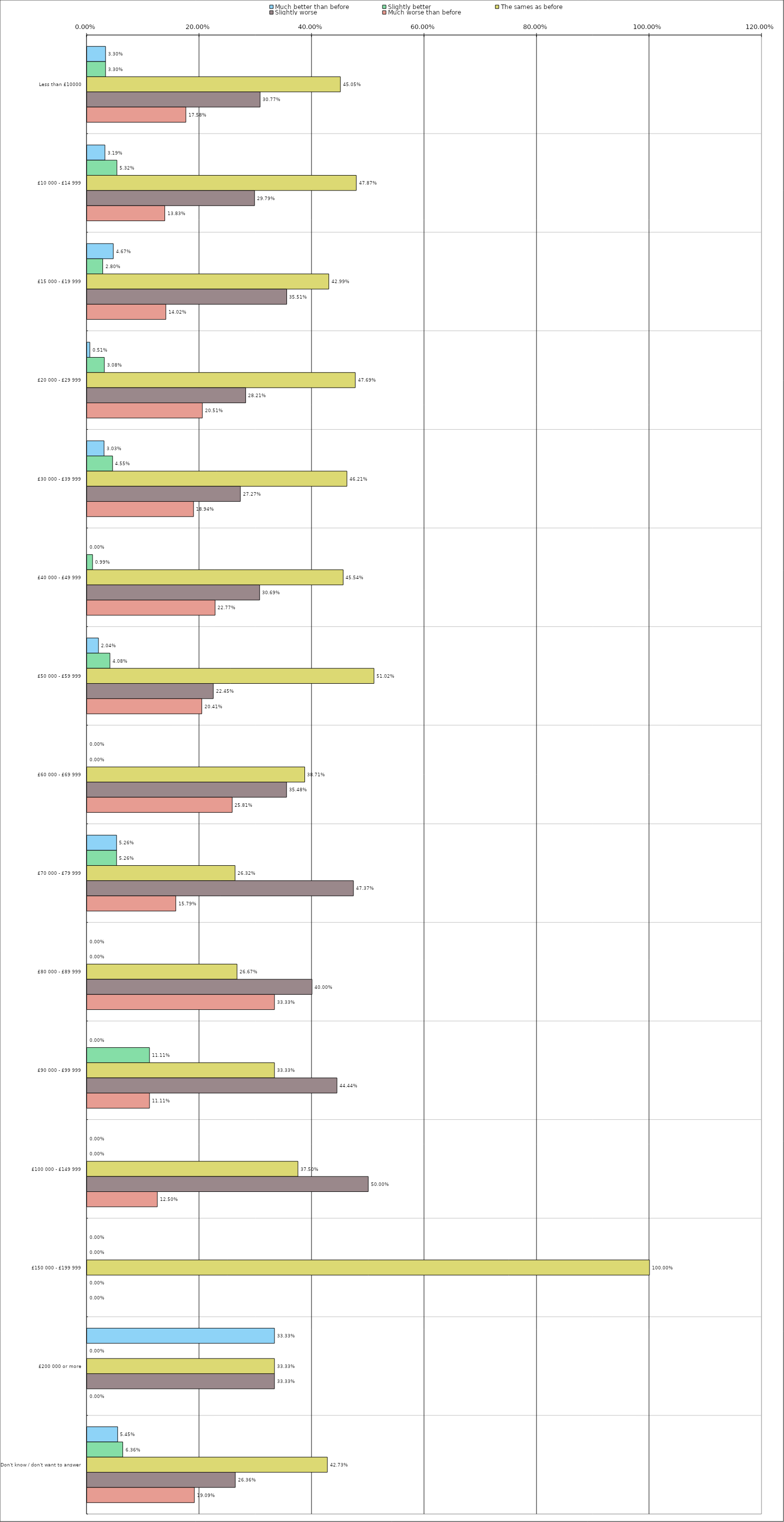
| Category | Much better than before | Slightly better | The sames as before | Slightly worse | Much worse than before |
|---|---|---|---|---|---|
| 0 | 0.033 | 0.033 | 0.45 | 0.308 | 0.176 |
| 1 | 0.032 | 0.053 | 0.479 | 0.298 | 0.138 |
| 2 | 0.047 | 0.028 | 0.43 | 0.355 | 0.14 |
| 3 | 0.005 | 0.031 | 0.477 | 0.282 | 0.205 |
| 4 | 0.03 | 0.046 | 0.462 | 0.273 | 0.189 |
| 5 | 0 | 0.01 | 0.455 | 0.307 | 0.228 |
| 6 | 0.02 | 0.041 | 0.51 | 0.224 | 0.204 |
| 7 | 0 | 0 | 0.387 | 0.355 | 0.258 |
| 8 | 0.053 | 0.053 | 0.263 | 0.474 | 0.158 |
| 9 | 0 | 0 | 0.267 | 0.4 | 0.333 |
| 10 | 0 | 0.111 | 0.333 | 0.444 | 0.111 |
| 11 | 0 | 0 | 0.375 | 0.5 | 0.125 |
| 12 | 0 | 0 | 1 | 0 | 0 |
| 13 | 0.333 | 0 | 0.333 | 0.333 | 0 |
| 14 | 0.054 | 0.064 | 0.427 | 0.264 | 0.191 |